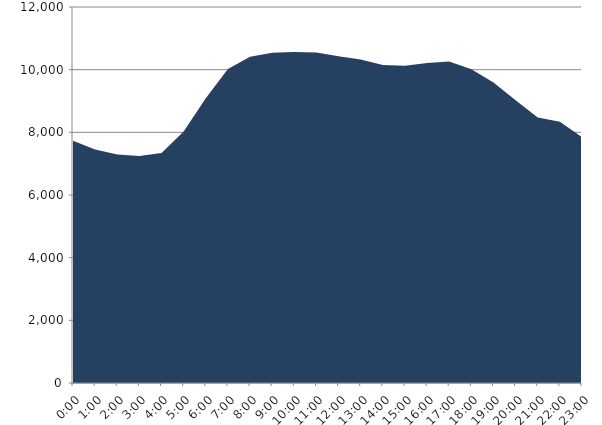
| Category | Series 0 | Series 1 |
|---|---|---|
| 2022-12-21 |  | 7733.411 |
| 2022-12-21 01:00:00 |  | 7451.094 |
| 2022-12-21 02:00:00 |  | 7296.507 |
| 2022-12-21 03:00:00 |  | 7243.922 |
| 2022-12-21 04:00:00 |  | 7342.455 |
| 2022-12-21 05:00:00 |  | 8030.061 |
| 2022-12-21 06:00:00 |  | 9091.424 |
| 2022-12-21 07:00:00 |  | 10019.641 |
| 2022-12-21 08:00:00 |  | 10412.348 |
| 2022-12-21 09:00:00 |  | 10536.38 |
| 2022-12-21 10:00:00 |  | 10564.165 |
| 2022-12-21 11:00:00 |  | 10548.895 |
| 2022-12-21 12:00:00 |  | 10431.468 |
| 2022-12-21 13:00:00 |  | 10324.898 |
| 2022-12-21 14:00:00 |  | 10148.417 |
| 2022-12-21 15:00:00 |  | 10122.225 |
| 2022-12-21 16:00:00 |  | 10211.073 |
| 2022-12-21 17:00:00 |  | 10263.936 |
| 2022-12-21 18:00:00 |  | 10010.422 |
| 2022-12-21 19:00:00 |  | 9590.016 |
| 2022-12-21 20:00:00 |  | 9026.155 |
| 2022-12-21 21:00:00 |  | 8476.617 |
| 2022-12-21 22:00:00 |  | 8339.748 |
| 2022-12-21 23:00:00 |  | 7840.769 |